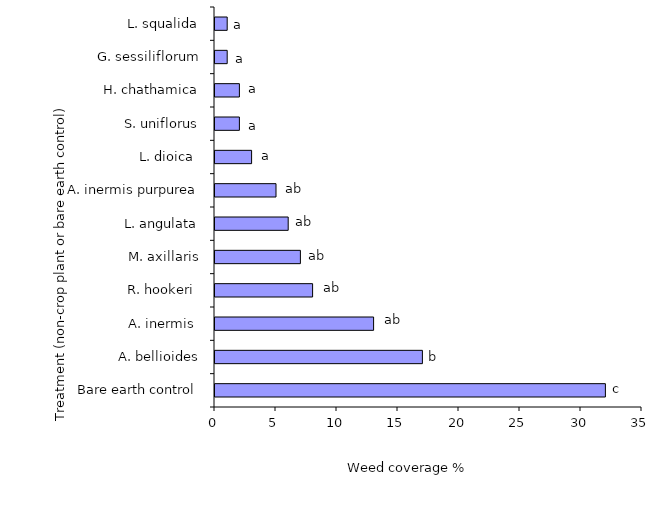
| Category | Series 0 |
|---|---|
| Bare earth control | 32 |
| A. bellioides | 17 |
| A. inermis  | 13 |
| R. hookeri  | 8 |
| M. axillaris | 7 |
| L. angulata | 6 |
| A. inermis purpurea | 5 |
| L. dioica  | 3 |
| S. uniflorus | 2 |
| H. chathamica | 2 |
| G. sessiliflorum | 1 |
| L. squalida | 1 |